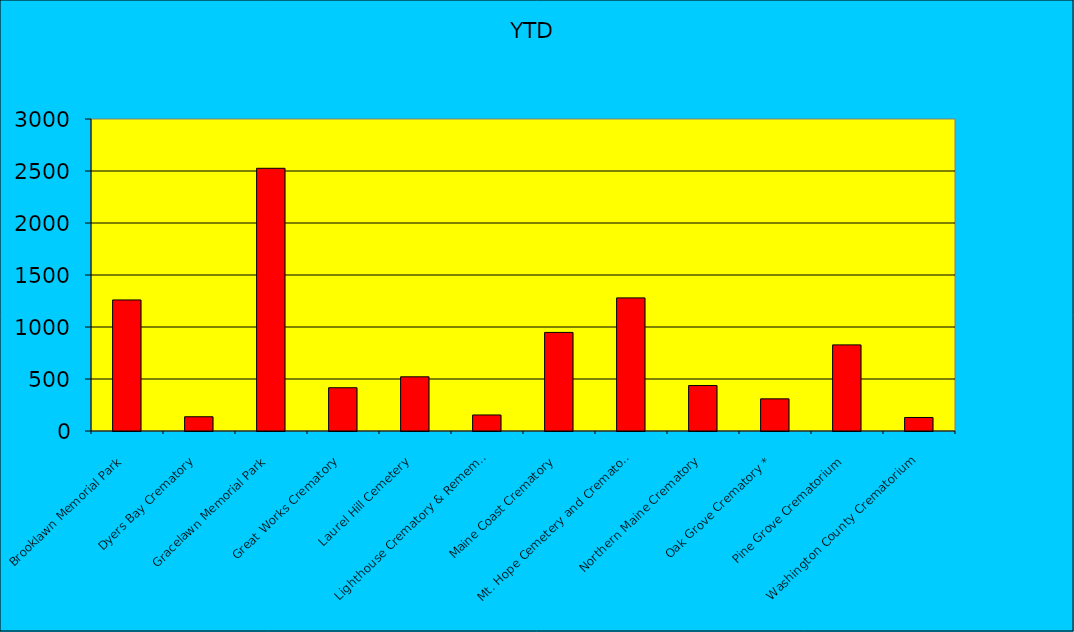
| Category | YTD |
|---|---|
| Brooklawn Memorial Park | 1260 |
| Dyers Bay Crematory | 137 |
| Gracelawn Memorial Park | 2526 |
| Great Works Crematory | 416 |
| Laurel Hill Cemetery | 521 |
| Lighthouse Crematory & Remembrance, Inc. | 154 |
| Maine Coast Crematory | 948 |
| Mt. Hope Cemetery and Crematory | 1280 |
| Northern Maine Crematory | 437 |
| Oak Grove Crematory * | 309 |
| Pine Grove Crematorium | 828 |
| Washington County Crematorium | 130 |